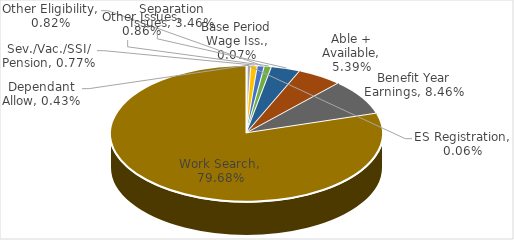
| Category | Series 0 |
|---|---|
| ES Registration | 0.001 |
| Base Period Wage Iss. | 0.001 |
| Dependant Allow | 0.004 |
| Sev./Vac./SSI/ Pension | 0.008 |
| Other Eligibility | 0.008 |
| Other Issues | 0.009 |
| Separation Issues | 0.035 |
| Able + Available | 0.054 |
| Benefit Year Earnings | 0.085 |
| Work Search | 0.797 |